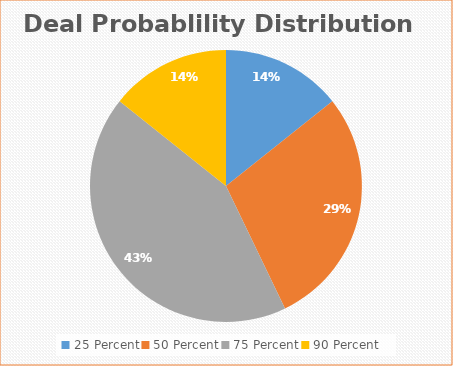
| Category | Series 0 |
|---|---|
| 25 Percent | 0.143 |
| 50 Percent | 0.286 |
| 75 Percent | 0.429 |
| 90 Percent | 0.143 |